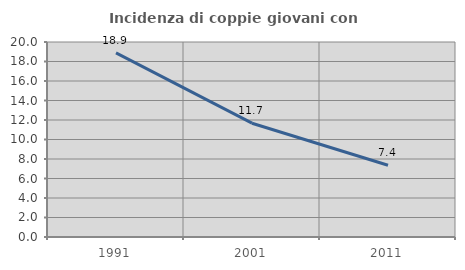
| Category | Incidenza di coppie giovani con figli |
|---|---|
| 1991.0 | 18.884 |
| 2001.0 | 11.671 |
| 2011.0 | 7.357 |